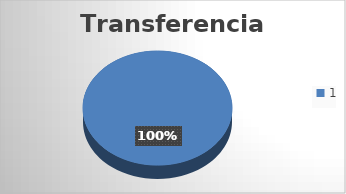
| Category | Transferencias |
|---|---|
| 0 | 8 |